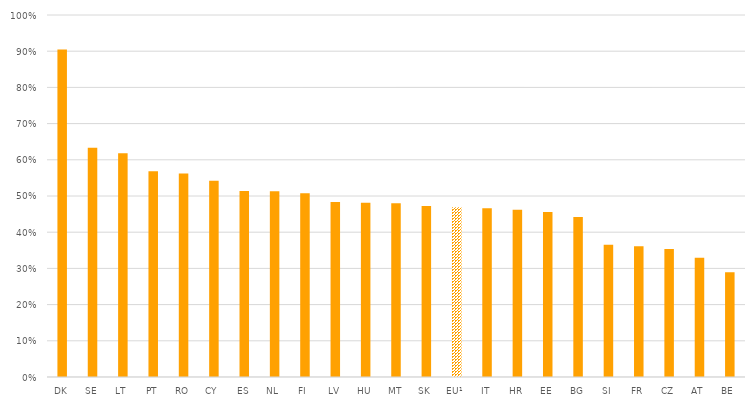
| Category | % |
|---|---|
| DK | 0.904 |
| SE | 0.633 |
| LT | 0.618 |
| PT | 0.568 |
| RO | 0.562 |
| CY | 0.542 |
| ES | 0.514 |
| NL | 0.513 |
| FI | 0.507 |
| LV | 0.483 |
| HU | 0.481 |
| MT | 0.48 |
| SK | 0.473 |
| EU¹ | 0.469 |
| IT | 0.466 |
| HR | 0.462 |
| EE | 0.456 |
| BG | 0.442 |
| SI | 0.365 |
| FR | 0.361 |
| CZ | 0.354 |
| AT | 0.329 |
| BE | 0.289 |